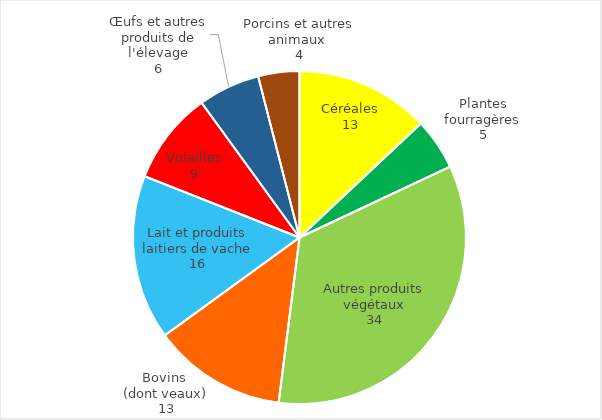
| Category | Series 0 |
|---|---|
| Céréales | 13 |
| Plantes fourragères | 5 |
| Autres produits végétaux | 34 |
| Bovins 
(dont veaux) | 13 |
| Lait et produits laitiers de vache | 16 |
| Volailles | 9 |
| Œufs et autres produits de l'élevage | 6 |
| Porcins et autres animaux  | 4 |